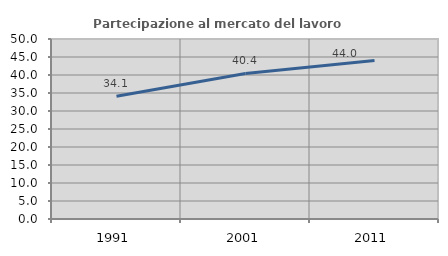
| Category | Partecipazione al mercato del lavoro  femminile |
|---|---|
| 1991.0 | 34.105 |
| 2001.0 | 40.432 |
| 2011.0 | 44.04 |